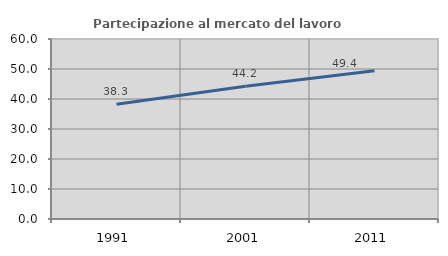
| Category | Partecipazione al mercato del lavoro  femminile |
|---|---|
| 1991.0 | 38.256 |
| 2001.0 | 44.239 |
| 2011.0 | 49.426 |